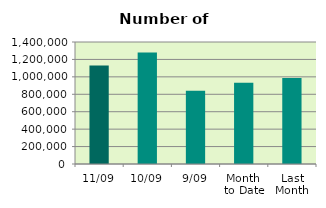
| Category | Series 0 |
|---|---|
| 11/09 | 1130068 |
| 10/09 | 1279526 |
| 9/09 | 839792 |
| Month 
to Date | 931919.75 |
| Last
Month | 986270.455 |